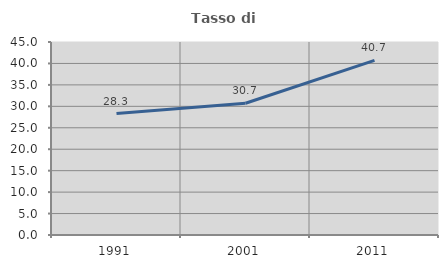
| Category | Tasso di occupazione   |
|---|---|
| 1991.0 | 28.32 |
| 2001.0 | 30.726 |
| 2011.0 | 40.727 |